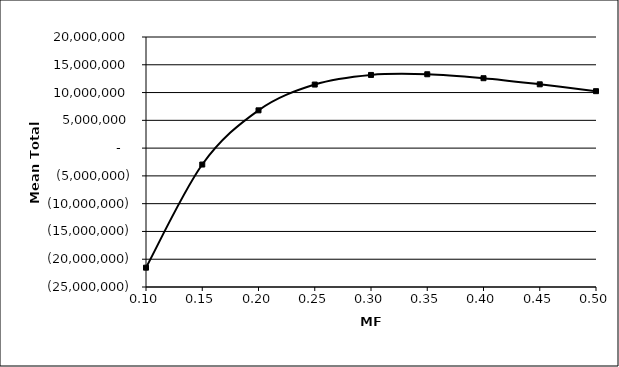
| Category | Series 1 |
|---|---|
| 0.1 | -21520485.642 |
| 0.15 | -2956183.542 |
| 0.2 | 6799866.808 |
| 0.25 | 11440784.196 |
| 0.3 | 13169013.969 |
| 0.35 | 13292322.836 |
| 0.4 | 12580954.156 |
| 0.45 | 11482397.994 |
| 0.5 | 10250876.025 |